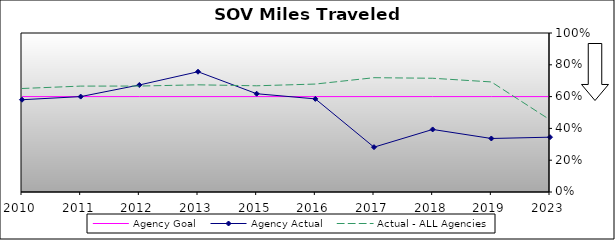
| Category | Agency Goal | Agency Actual | Actual - ALL Agencies |
|---|---|---|---|
| 2010.0 | 0.6 | 0.58 | 0.651 |
| 2011.0 | 0.6 | 0.6 | 0.666 |
| 2012.0 | 0.6 | 0.673 | 0.666 |
| 2013.0 | 0.6 | 0.756 | 0.674 |
| 2015.0 | 0.6 | 0.618 | 0.668 |
| 2016.0 | 0.6 | 0.586 | 0.679 |
| 2017.0 | 0.6 | 0.282 | 0.719 |
| 2018.0 | 0.6 | 0.393 | 0.715 |
| 2019.0 | 0.6 | 0.336 | 0.692 |
| 2023.0 | 0.6 | 0.345 | 0.454 |